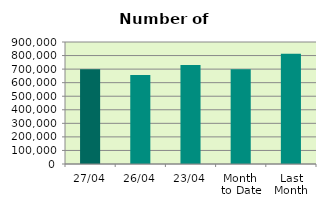
| Category | Series 0 |
|---|---|
| 27/04 | 698500 |
| 26/04 | 655804 |
| 23/04 | 729480 |
| Month 
to Date | 699098.588 |
| Last
Month | 813408 |